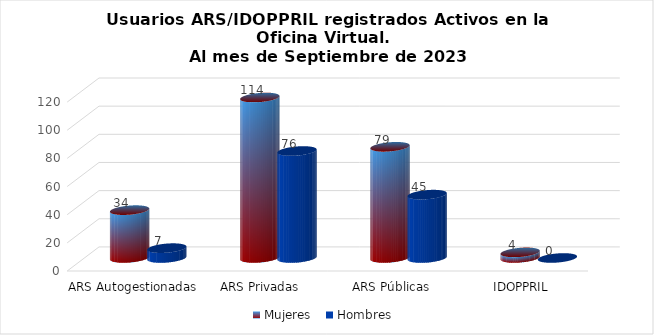
| Category | Mujeres | Hombres |
|---|---|---|
| ARS Autogestionadas | 34 | 7 |
| ARS Privadas | 114 | 76 |
| ARS Públicas | 79 | 45 |
| IDOPPRIL | 4 | 0 |